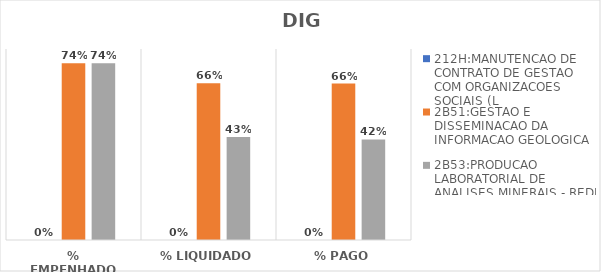
| Category | 212H:MANUTENCAO DE CONTRATO DE GESTAO COM ORGANIZACOES SOCIAIS (L | 2B51:GESTAO E DISSEMINACAO DA INFORMACAO GEOLOGICA | 2B53:PRODUCAO LABORATORIAL DE ANALISES MINERAIS - REDE LAMIN |
|---|---|---|---|
| % EMPENHADO | 0 | 0.741 | 0.74 |
| % LIQUIDADO | 0 | 0.656 | 0.431 |
| % PAGO | 0 | 0.655 | 0.421 |